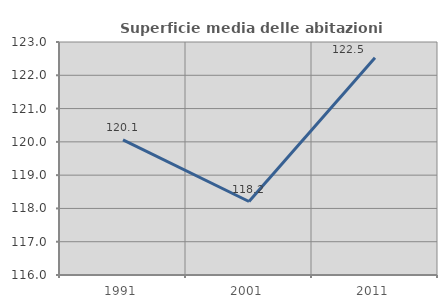
| Category | Superficie media delle abitazioni occupate |
|---|---|
| 1991.0 | 120.059 |
| 2001.0 | 118.208 |
| 2011.0 | 122.525 |